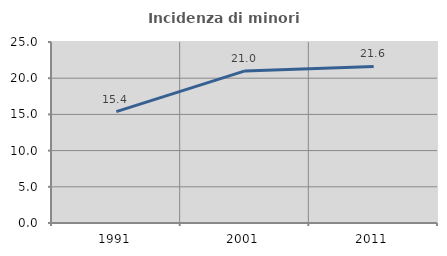
| Category | Incidenza di minori stranieri |
|---|---|
| 1991.0 | 15.385 |
| 2001.0 | 21.008 |
| 2011.0 | 21.622 |